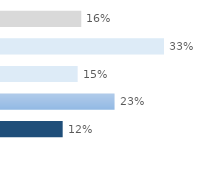
| Category | Series 0 |
|---|---|
| Non renseigné | 0.162 |
| < 50 € | 0.329 |
| 50 ≤ € < 100 | 0.155 |
| 100 ≤ € < 500 | 0.229 |
| ≥ 500 € | 0.125 |